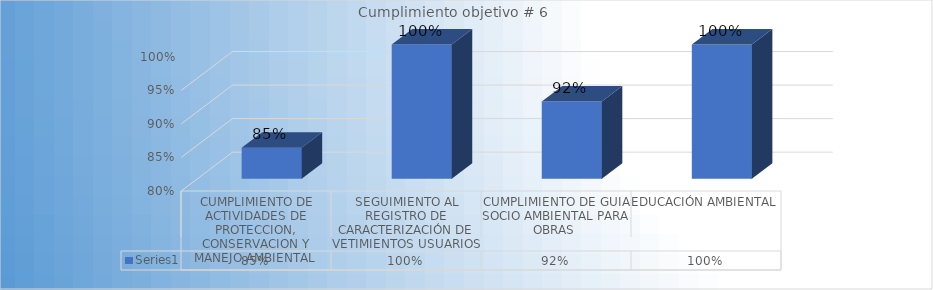
| Category | Series 0 |
|---|---|
| CUMPLIMIENTO DE ACTIVIDADES DE PROTECCION, CONSERVACION Y MANEJO AMBIENTAL  | 0.846 |
| SEGUIMIENTO AL REGISTRO DE CARACTERIZACIÓN DE VETIMIENTOS USUARIOS | 1 |
| CUMPLIMIENTO DE GUIA SOCIO AMBIENTAL PARA OBRAS  | 0.915 |
| EDUCACIÓN AMBIENTAL | 1 |